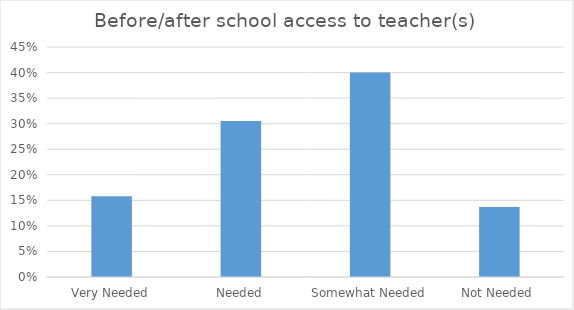
| Category | Before/after school access to teacher(s)  |
|---|---|
| Very Needed | 0.158 |
| Needed | 0.305 |
| Somewhat Needed | 0.4 |
| Not Needed | 0.137 |